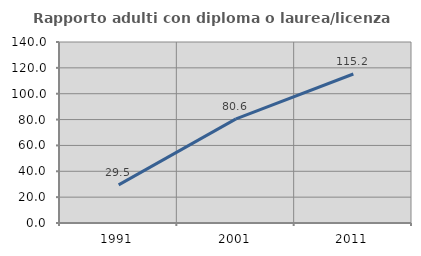
| Category | Rapporto adulti con diploma o laurea/licenza media  |
|---|---|
| 1991.0 | 29.519 |
| 2001.0 | 80.556 |
| 2011.0 | 115.238 |